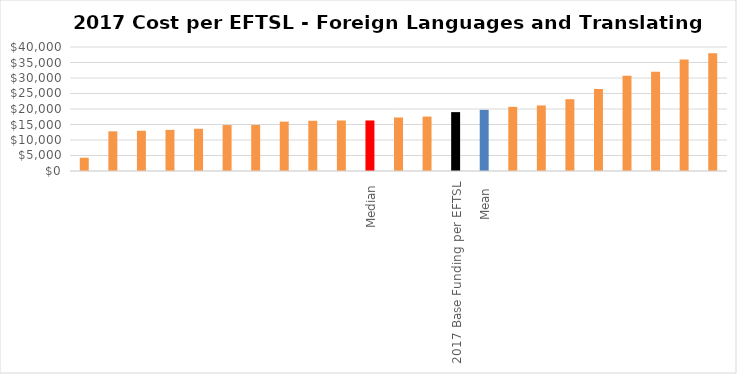
| Category | Series 0 |
|---|---|
|  | 4284.215 |
|  | 12794.734 |
|  | 12979.441 |
|  | 13267.57 |
|  | 13630.185 |
|  | 14818.296 |
|  | 14864.257 |
|  | 15923.696 |
|  | 16205.139 |
|  | 16291.408 |
| Median | 16300.382 |
|  | 17270.095 |
|  | 17555.958 |
| 2017 Base Funding per EFTSL | 18990 |
| Mean  | 19729 |